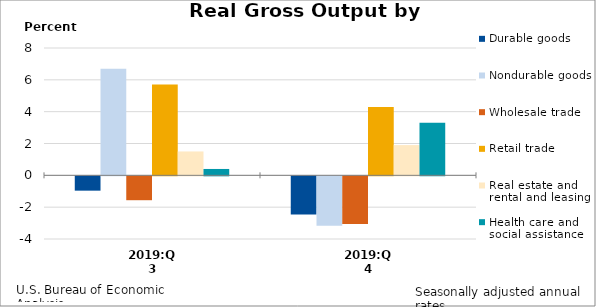
| Category | Durable goods | Nondurable goods | Wholesale trade | Retail trade | Real estate and rental and leasing | Health care and social assistance |
|---|---|---|---|---|---|---|
| 2019:Q3 | -0.9 | 6.7 | -1.5 | 5.7 | 1.5 | 0.4 |
| 2019:Q4 | -2.4 | -3.1 | -3 | 4.3 | 1.9 | 3.3 |